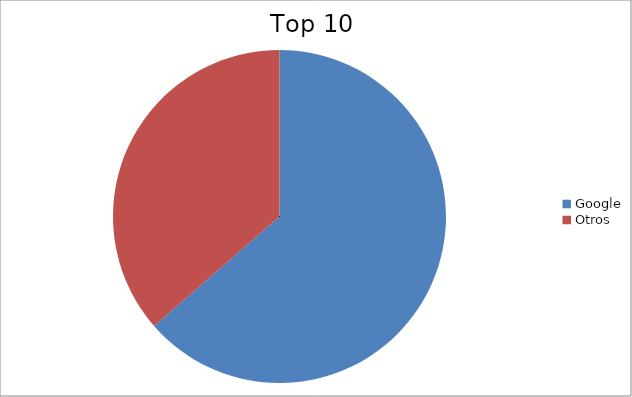
| Category | Series 0 |
|---|---|
| Google | 63.57 |
| Otros | 36.43 |